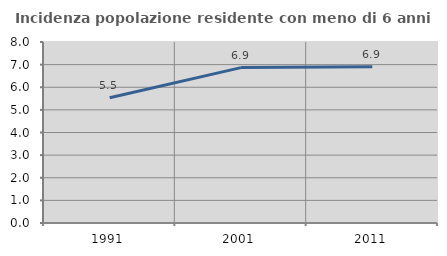
| Category | Incidenza popolazione residente con meno di 6 anni |
|---|---|
| 1991.0 | 5.535 |
| 2001.0 | 6.868 |
| 2011.0 | 6.901 |